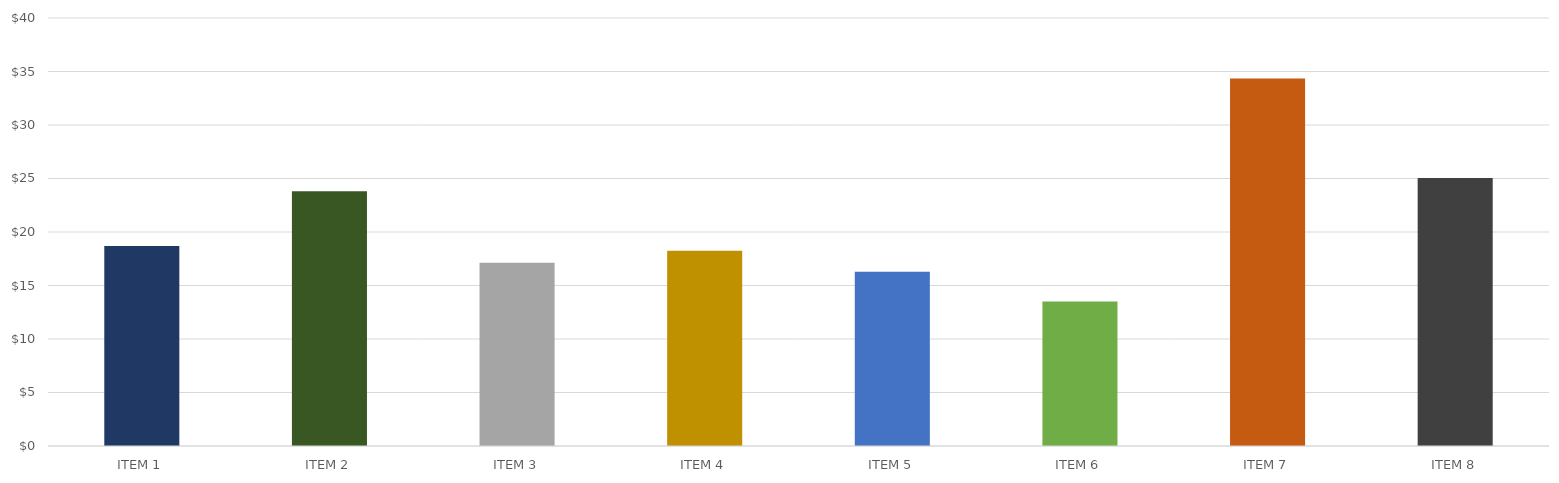
| Category | LUCRO POR ITEM |
|---|---|
| ITEM 1 | 18.685 |
| ITEM 2 | 23.815 |
| ITEM 3 | 17.125 |
| ITEM 4 | 18.25 |
| ITEM 5 | 16.275 |
| ITEM 6 | 13.5 |
| ITEM 7 | 34.35 |
| ITEM 8 | 25.04 |